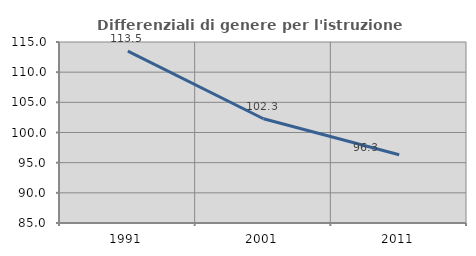
| Category | Differenziali di genere per l'istruzione superiore |
|---|---|
| 1991.0 | 113.492 |
| 2001.0 | 102.278 |
| 2011.0 | 96.323 |